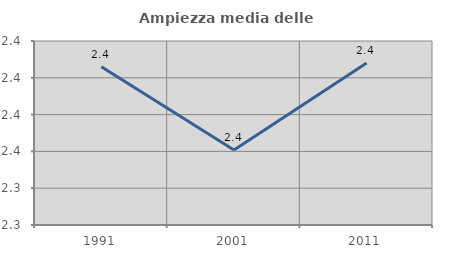
| Category | Ampiezza media delle famiglie |
|---|---|
| 1991.0 | 2.406 |
| 2001.0 | 2.361 |
| 2011.0 | 2.408 |